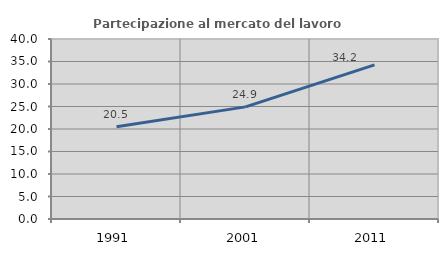
| Category | Partecipazione al mercato del lavoro  femminile |
|---|---|
| 1991.0 | 20.488 |
| 2001.0 | 24.915 |
| 2011.0 | 34.248 |